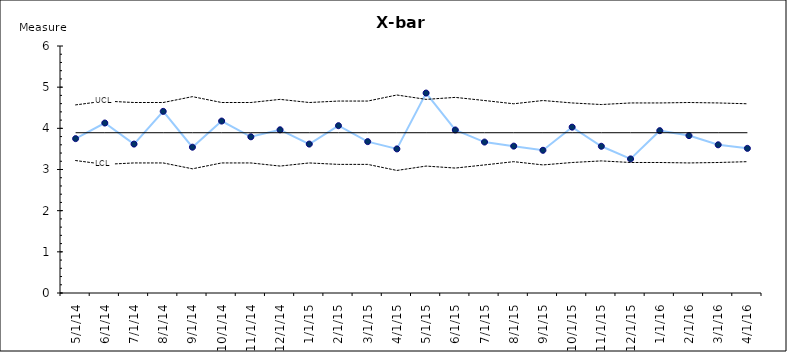
| Category | Subgroup | Center | UCL | LCL |
|---|---|---|---|---|
| 5/1/14 | 3.75 | 3.893 | 4.569 | 3.217 |
| 6/1/14 | 4.129 | 3.893 | 4.663 | 3.124 |
| 7/1/14 | 3.618 | 3.893 | 4.627 | 3.159 |
| 8/1/14 | 4.412 | 3.893 | 4.627 | 3.159 |
| 9/1/14 | 3.542 | 3.893 | 4.77 | 3.017 |
| 10/1/14 | 4.176 | 3.893 | 4.627 | 3.159 |
| 11/1/14 | 3.794 | 3.893 | 4.627 | 3.159 |
| 12/1/14 | 3.964 | 3.893 | 4.703 | 3.083 |
| 1/1/15 | 3.618 | 3.893 | 4.627 | 3.159 |
| 2/1/15 | 4.065 | 3.893 | 4.663 | 3.124 |
| 3/1/15 | 3.677 | 3.893 | 4.663 | 3.124 |
| 4/1/15 | 3.5 | 3.893 | 4.81 | 2.977 |
| 5/1/15 | 4.857 | 3.893 | 4.703 | 3.083 |
| 6/1/15 | 3.96 | 3.893 | 4.752 | 3.035 |
| 7/1/15 | 3.667 | 3.893 | 4.676 | 3.111 |
| 8/1/15 | 3.568 | 3.893 | 4.596 | 3.19 |
| 9/1/15 | 3.467 | 3.893 | 4.676 | 3.111 |
| 10/1/15 | 4.029 | 3.893 | 4.617 | 3.17 |
| 11/1/15 | 3.564 | 3.893 | 4.578 | 3.209 |
| 12/1/15 | 3.257 | 3.893 | 4.617 | 3.17 |
| 1/1/16 | 3.943 | 3.893 | 4.617 | 3.17 |
| 2/1/16 | 3.824 | 3.893 | 4.627 | 3.159 |
| 3/1/16 | 3.6 | 3.893 | 4.617 | 3.17 |
| 4/1/16 | 3.514 | 3.893 | 4.596 | 3.19 |